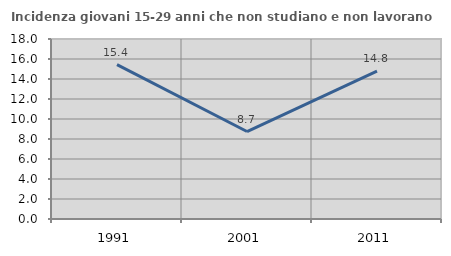
| Category | Incidenza giovani 15-29 anni che non studiano e non lavorano  |
|---|---|
| 1991.0 | 15.444 |
| 2001.0 | 8.747 |
| 2011.0 | 14.795 |